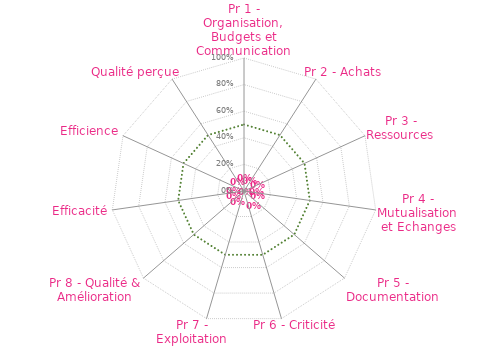
| Category | Seuil 17050 | RADAR pour Preuves Validées "Non Vides" |
|---|---|---|
| Pr 1 - Organisation, Budgets et Communication | 0.5 | 0 |
| Pr 2 - Achats | 0.5 | 0 |
| Pr 3 - Ressources | 0.5 | 0 |
| Pr 4 - Mutualisation et Echanges | 0.5 | 0 |
| Pr 5 - Documentation | 0.5 | 0 |
| Pr 6 - Criticité | 0.5 | 0 |
| Pr 7 - Exploitation | 0.5 | 0 |
| Pr 8 - Qualité & Amélioration | 0.5 | 0 |
| Efficacité | 0.5 | 0 |
| Efficience | 0.5 | 0 |
| Qualité perçue | 0.5 | 0 |